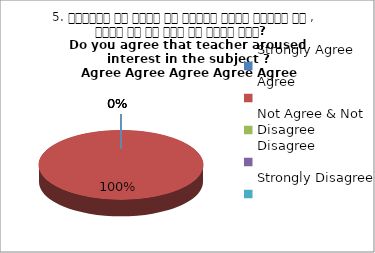
| Category | 5. शिक्षक ने विषय के प्रति रूचि जागृत की , क्या आप इस बात से सहमत हैं?  
Do you agree that teacher aroused interest in the subject ?
 Agree Agree Agree Agree Agree |
|---|---|
| Strongly Agree | 0 |
| Agree | 4 |
| Not Agree & Not Disagree | 0 |
| Disagree | 0 |
| Strongly Disagree | 0 |